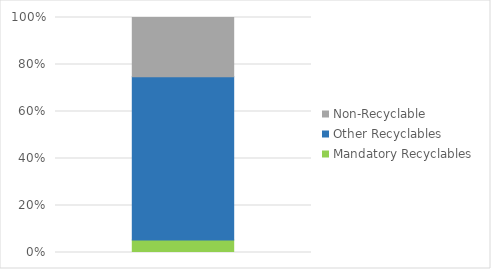
| Category | Mandatory Recyclables | Other Recyclables | Non-Recyclable |
|---|---|---|---|
| 0 | 5.274 | 69.5 | 25.2 |